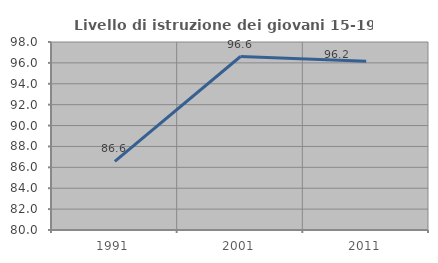
| Category | Livello di istruzione dei giovani 15-19 anni |
|---|---|
| 1991.0 | 86.567 |
| 2001.0 | 96.61 |
| 2011.0 | 96.154 |